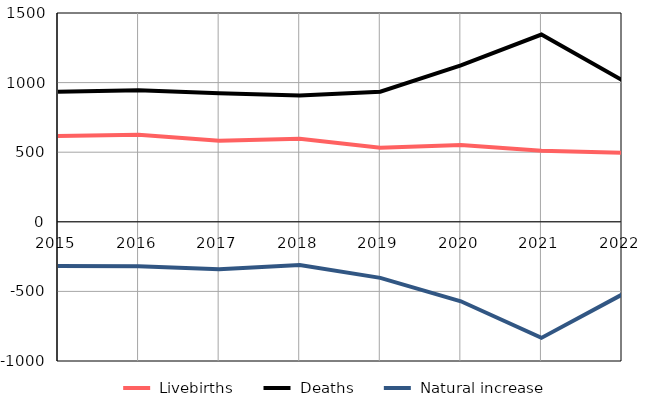
| Category |  Livebirths |  Deaths |  Natural increase |
|---|---|---|---|
| 2015.0 | 617 | 935 | -318 |
| 2016.0 | 625 | 945 | -320 |
| 2017.0 | 583 | 924 | -341 |
| 2018.0 | 597 | 908 | -311 |
| 2019.0 | 532 | 935 | -403 |
| 2020.0 | 552 | 1123 | -571 |
| 2021.0 | 511 | 1345 | -834 |
| 2022.0 | 495 | 1018 | -523 |